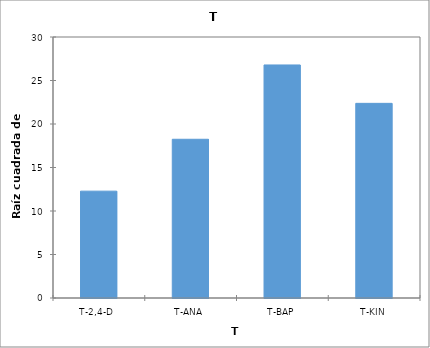
| Category | Series 0 |
|---|---|
| T-2,4-D | 12.282 |
| T-ANA | 18.244 |
| T-BAP | 26.786 |
| T-KIN | 22.374 |